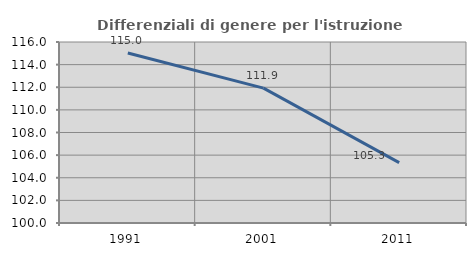
| Category | Differenziali di genere per l'istruzione superiore |
|---|---|
| 1991.0 | 115.033 |
| 2001.0 | 111.926 |
| 2011.0 | 105.34 |